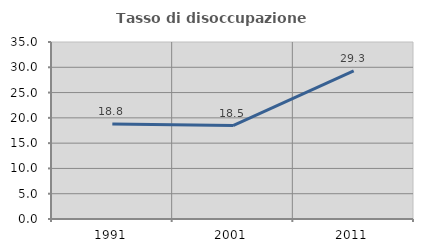
| Category | Tasso di disoccupazione giovanile  |
|---|---|
| 1991.0 | 18.785 |
| 2001.0 | 18.478 |
| 2011.0 | 29.268 |